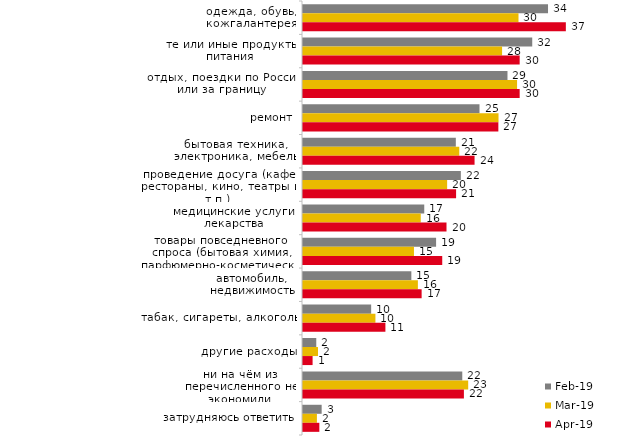
| Category | фев.19 | мар.19 | апр.19 |
|---|---|---|---|
| одежда, обувь, кожгалантерея | 34.15 | 30.035 | 36.634 |
| те или иные продукты питания | 31.95 | 27.747 | 30.198 |
| отдых, поездки по России или за границу | 28.5 | 29.836 | 30.198 |
| ремонт | 24.6 | 27.25 | 27.228 |
| бытовая техника, электроника, мебель | 21.3 | 21.78 | 23.911 |
| проведение досуга (кафе, рестораны, кино, театры и т.п.) | 22 | 20.09 | 21.337 |
| медицинские услуги, лекарства | 16.9 | 16.41 | 20 |
| товары повседневного спроса (бытовая химия, парфюмерно-косметические товары и т.д.) | 18.55 | 15.465 | 19.406 |
| автомобиль, недвижимость | 15.1 | 16.012 | 16.535 |
| табак, сигареты, алкоголь | 9.5 | 10.094 | 11.485 |
| другие расходы | 1.85 | 2.089 | 1.337 |
| ни на чём из перечисленного не экономили | 22.2 | 23.023 | 22.426 |
| затрудняюсь ответить | 2.6 | 1.939 | 2.277 |